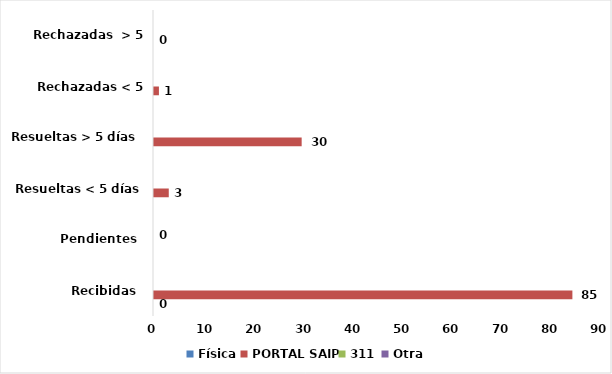
| Category | Física | PORTAL SAIP | 311 | Otra |
|---|---|---|---|---|
| Recibidas  | 0 | 85 | 0 | 0 |
| Pendientes  | 0 | 0 | 0 | 0 |
| Resueltas < 5 días | 0 | 3 | 0 | 0 |
| Resueltas > 5 días  | 0 | 30 | 0 | 0 |
| Rechazadas < 5 días  | 0 | 1 | 0 | 0 |
| Rechazadas  > 5 días | 0 | 0 | 0 | 0 |